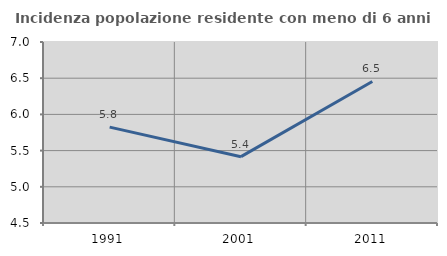
| Category | Incidenza popolazione residente con meno di 6 anni |
|---|---|
| 1991.0 | 5.824 |
| 2001.0 | 5.416 |
| 2011.0 | 6.455 |